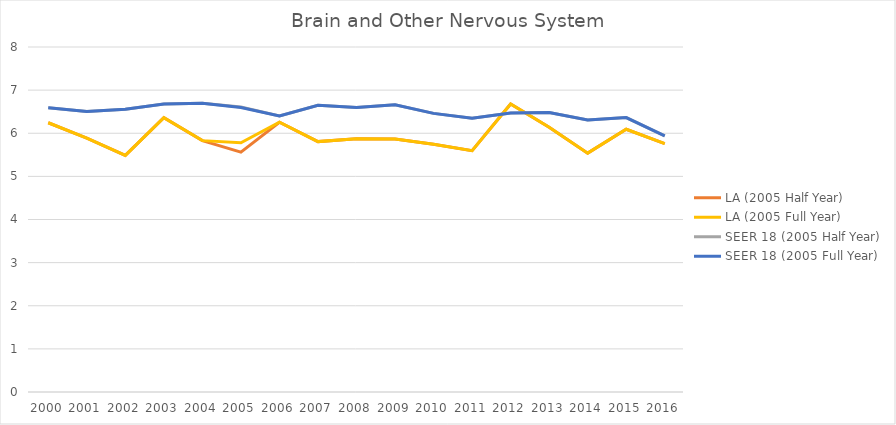
| Category | LA (2005 Half Year) | LA (2005 Full Year) | SEER 18 (2005 Half Year) | SEER 18 (2005 Full Year) |
|---|---|---|---|---|
| 2000.0 | 6.243 | 6.243 | 6.591 | 6.591 |
| 2001.0 | 5.886 | 5.886 | 6.506 | 6.506 |
| 2002.0 | 5.486 | 5.486 | 6.556 | 6.556 |
| 2003.0 | 6.361 | 6.361 | 6.677 | 6.677 |
| 2004.0 | 5.829 | 5.829 | 6.696 | 6.696 |
| 2005.0 | 5.563 | 5.78 | 6.608 | 6.595 |
| 2006.0 | 6.254 | 6.254 | 6.402 | 6.402 |
| 2007.0 | 5.806 | 5.806 | 6.647 | 6.647 |
| 2008.0 | 5.871 | 5.871 | 6.6 | 6.6 |
| 2009.0 | 5.867 | 5.867 | 6.659 | 6.659 |
| 2010.0 | 5.743 | 5.743 | 6.461 | 6.461 |
| 2011.0 | 5.596 | 5.596 | 6.347 | 6.347 |
| 2012.0 | 6.68 | 6.68 | 6.469 | 6.469 |
| 2013.0 | 6.14 | 6.14 | 6.481 | 6.481 |
| 2014.0 | 5.539 | 5.539 | 6.305 | 6.305 |
| 2015.0 | 6.092 | 6.092 | 6.364 | 6.364 |
| 2016.0 | 5.759 | 5.759 | 5.939 | 5.939 |